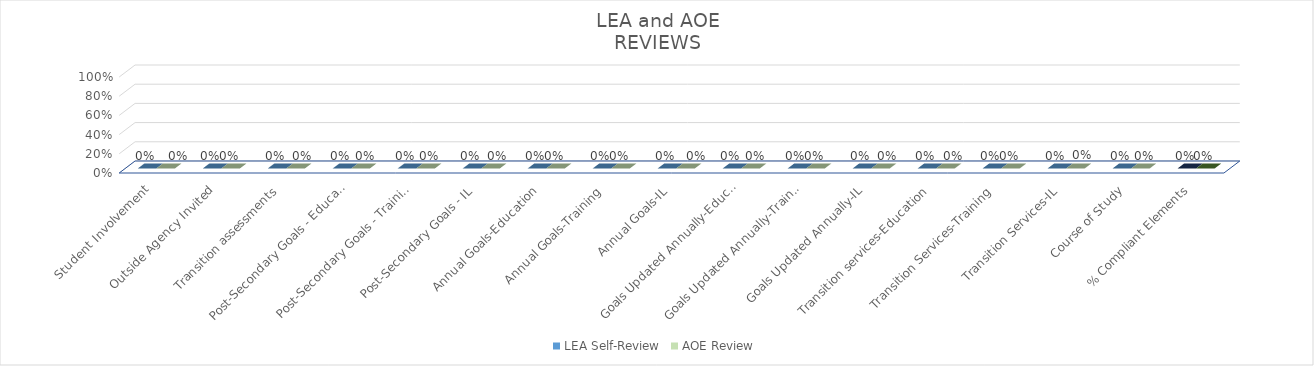
| Category | LEA Self-Review | AOE Review |
|---|---|---|
| Student Involvement | 0 | 0 |
| Outside Agency Invited | 0 | 0 |
| Transition assessments | 0 | 0 |
| Post-Secondary Goals - Education | 0 | 0 |
| Post-Secondary Goals - Training | 0 | 0 |
| Post-Secondary Goals - IL | 0 | 0 |
| Annual Goals-Education | 0 | 0 |
| Annual Goals-Training | 0 | 0 |
| Annual Goals-IL | 0 | 0 |
| Goals Updated Annually-Education | 0 | 0 |
| Goals Updated Annually-Training | 0 | 0 |
| Goals Updated Annually-IL | 0 | 0 |
| Transition services-Education | 0 | 0 |
| Transition Services-Training | 0 | 0 |
| Transition Services-IL | 0 | 0 |
| Course of Study | 0 | 0 |
| % Compliant Elements | 0 | 0 |